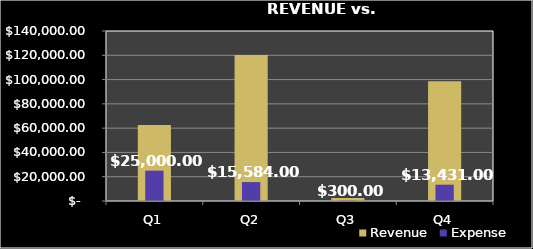
| Category | Revenue |
|---|---|
| Q1 | 62500 |
| Q2 | 120300 |
| Q3 | 2500 |
| Q4 | 98654 |